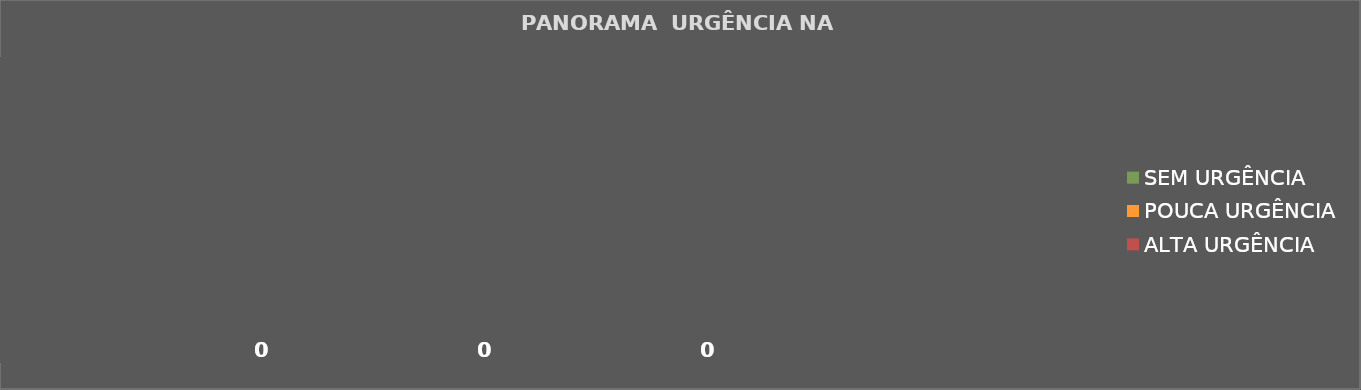
| Category | SEM URGÊNCIA | POUCA URGÊNCIA | ALTA URGÊNCIA |
|---|---|---|---|
| 0 | 0 | 0 | 0 |